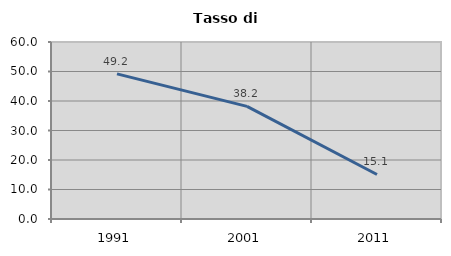
| Category | Tasso di disoccupazione   |
|---|---|
| 1991.0 | 49.187 |
| 2001.0 | 38.182 |
| 2011.0 | 15.094 |